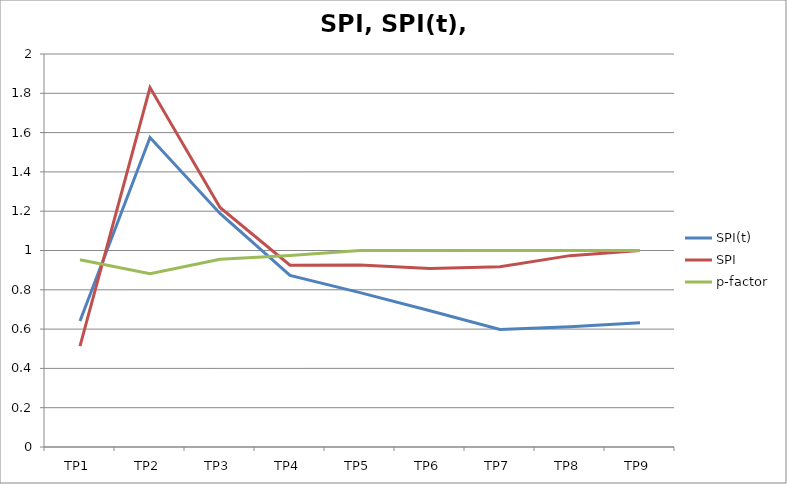
| Category | SPI(t) | SPI | p-factor |
|---|---|---|---|
| TP1 | 0.642 | 0.513 | 0.953 |
| TP2 | 1.575 | 1.829 | 0.882 |
| TP3 | 1.189 | 1.219 | 0.955 |
| TP4 | 0.873 | 0.925 | 0.975 |
| TP5 | 0.786 | 0.926 | 1 |
| TP6 | 0.693 | 0.908 | 1 |
| TP7 | 0.598 | 0.917 | 1 |
| TP8 | 0.612 | 0.974 | 1 |
| TP9 | 0.632 | 1 | 1 |